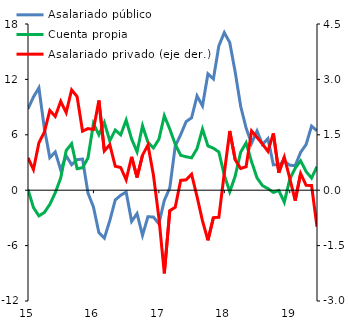
| Category | Asalariado público  | Cuenta propia |
|---|---|---|
| 2015-01-31 | 8.808 | 0.078 |
| 2015-02-28 | 10.098 | -1.883 |
| 2015-03-31 | 11.088 | -2.782 |
| 2015-04-30 | 6.686 | -2.41 |
| 2015-05-31 | 3.524 | -1.543 |
| 2015-06-30 | 4.135 | -0.272 |
| 2015-07-31 | 2.19 | 1.326 |
| 2015-08-31 | 3.733 | 4.289 |
| 2015-09-30 | 2.758 | 5.034 |
| 2015-10-31 | 3.304 | 2.328 |
| 2015-11-30 | 3.377 | 2.437 |
| 2015-12-31 | -0.317 | 3.488 |
| 2016-01-31 | -1.811 | 7.224 |
| 2016-02-29 | -4.602 | 6.002 |
| 2016-03-31 | -5.197 | 7.326 |
| 2016-04-30 | -3.293 | 5.343 |
| 2016-05-31 | -1.063 | 6.513 |
| 2016-06-30 | -0.547 | 5.992 |
| 2016-07-31 | -0.194 | 7.589 |
| 2016-08-31 | -3.381 | 5.543 |
| 2016-09-30 | -2.532 | 4.155 |
| 2016-10-31 | -4.884 | 6.979 |
| 2016-11-30 | -2.867 | 5.19 |
| 2016-12-31 | -2.91 | 4.573 |
| 2017-01-31 | -3.632 | 5.504 |
| 2017-02-28 | -1.103 | 8.066 |
| 2017-03-31 | 0.238 | 6.621 |
| 2017-04-30 | 4.768 | 4.981 |
| 2017-05-31 | 6.018 | 3.778 |
| 2017-06-30 | 7.43 | 3.619 |
| 2017-07-31 | 7.841 | 3.504 |
| 2017-08-31 | 10.211 | 4.501 |
| 2017-09-30 | 9.133 | 6.621 |
| 2017-10-31 | 12.605 | 4.795 |
| 2017-11-30 | 12.047 | 4.549 |
| 2017-12-31 | 15.633 | 4.139 |
| 2018-01-31 | 17.07 | 1.632 |
| 2018-02-28 | 15.988 | -0.174 |
| 2018-03-31 | 12.789 | 1.533 |
| 2018-04-30 | 9.097 | 4.114 |
| 2018-05-31 | 6.729 | 5.126 |
| 2018-06-30 | 5.084 | 3.084 |
| 2018-07-31 | 6.415 | 1.337 |
| 2018-08-31 | 4.954 | 0.495 |
| 2018-09-30 | 5.585 | 0.177 |
| 2018-10-31 | 2.745 | -0.242 |
| 2018-11-30 | 2.766 | -0.031 |
| 2018-12-31 | 3.153 | -1.299 |
| 2019-01-31 | 2.709 | 1.175 |
| 2019-02-28 | 2.652 | 2.385 |
| 2019-03-31 | 4.106 | 3.183 |
| 2019-04-30 | 4.945 | 2.018 |
| 2019-05-31 | 6.942 | 1.319 |
| 2019-06-30 | 6.43 | 2.552 |